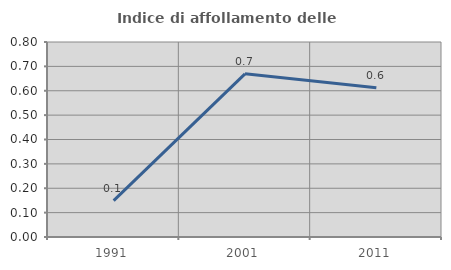
| Category | Indice di affollamento delle abitazioni  |
|---|---|
| 1991.0 | 0.149 |
| 2001.0 | 0.669 |
| 2011.0 | 0.613 |